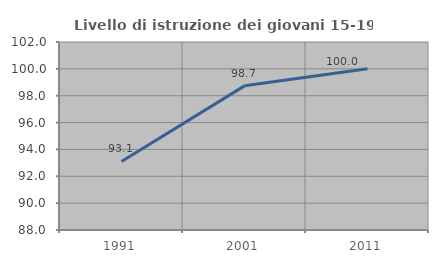
| Category | Livello di istruzione dei giovani 15-19 anni |
|---|---|
| 1991.0 | 93.103 |
| 2001.0 | 98.734 |
| 2011.0 | 100 |